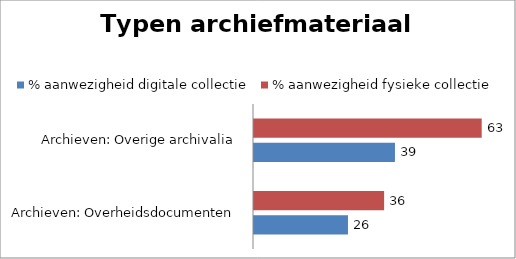
| Category | % aanwezigheid digitale collectie | % aanwezigheid fysieke collectie |
|---|---|---|
| Archieven: Overheidsdocumenten | 26 | 36 |
| Archieven: Overige archivalia | 39 | 63 |